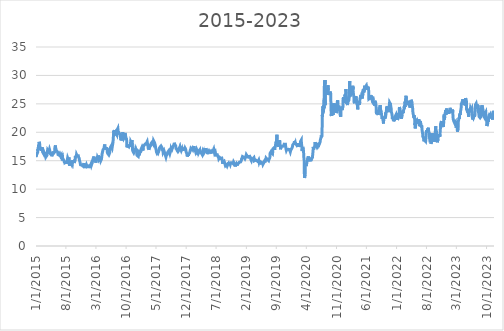
| Category | Fiyat |
|---|---|
| 1/1/15 | 15.65 |
| 1/2/15 | 15.72 |
| 1/5/15 | 15.73 |
| 1/6/15 | 16.17 |
| 1/7/15 | 16.51 |
| 1/8/15 | 16.49 |
| 1/9/15 | 16.31 |
| 1/12/15 | 16.48 |
| 1/13/15 | 16.53 |
| 1/14/15 | 17.02 |
| 1/15/15 | 16.81 |
| 1/16/15 | 16.89 |
| 1/19/15 | 17.7 |
| 1/20/15 | 17.66 |
| 1/21/15 | 17.94 |
| 1/22/15 | 18.08 |
| 1/23/15 | 18.32 |
| 1/26/15 | 18.3 |
| 1/27/15 | 17.88 |
| 1/28/15 | 18.02 |
| 1/29/15 | 17.96 |
| 1/30/15 | 16.94 |
| 2/2/15 | 17.16 |
| 2/3/15 | 17.2 |
| 2/4/15 | 17.29 |
| 2/5/15 | 17.36 |
| 2/6/15 | 17.24 |
| 2/9/15 | 16.76 |
| 2/10/15 | 16.98 |
| 2/11/15 | 16.89 |
| 2/12/15 | 16.78 |
| 2/13/15 | 16.82 |
| 2/16/15 | 17.33 |
| 2/17/15 | 17.29 |
| 2/18/15 | 16.47 |
| 2/19/15 | 16.45 |
| 2/20/15 | 16.37 |
| 2/23/15 | 16.24 |
| 2/24/15 | 16.28 |
| 2/25/15 | 16.24 |
| 2/26/15 | 16.53 |
| 2/27/15 | 16.53 |
| 3/2/15 | 16.57 |
| 3/3/15 | 16.36 |
| 3/4/15 | 16.25 |
| 3/5/15 | 16.21 |
| 3/6/15 | 16.16 |
| 3/9/15 | 15.89 |
| 3/10/15 | 15.72 |
| 3/11/15 | 15.63 |
| 3/12/15 | 15.5 |
| 3/13/15 | 15.56 |
| 3/16/15 | 15.63 |
| 3/17/15 | 15.64 |
| 3/18/15 | 15.55 |
| 3/19/15 | 15.94 |
| 3/20/15 | 16.11 |
| 3/23/15 | 16.74 |
| 3/24/15 | 16.92 |
| 3/25/15 | 16.93 |
| 3/26/15 | 16.94 |
| 3/27/15 | 17.08 |
| 3/30/15 | 16.93 |
| 3/31/15 | 16.68 |
| 4/1/15 | 16.6 |
| 4/2/15 | 16.95 |
| 4/3/15 | 16.73 |
| 4/6/15 | 17 |
| 4/7/15 | 16.94 |
| 4/8/15 | 16.82 |
| 4/9/15 | 16.51 |
| 4/10/15 | 16.15 |
| 4/13/15 | 16.43 |
| 4/14/15 | 16.26 |
| 4/15/15 | 16.14 |
| 4/16/15 | 16.29 |
| 4/17/15 | 16.29 |
| 4/20/15 | 16.28 |
| 4/21/15 | 15.96 |
| 4/22/15 | 15.92 |
| 4/23/15 | 15.78 |
| 4/24/15 | 15.9 |
| 4/27/15 | 15.74 |
| 4/28/15 | 16.38 |
| 4/29/15 | 16.61 |
| 4/30/15 | 16.55 |
| 5/1/15 | 16.14 |
| 5/4/15 | 16.15 |
| 5/5/15 | 16.42 |
| 5/6/15 | 16.53 |
| 5/7/15 | 16.52 |
| 5/8/15 | 16.32 |
| 5/11/15 | 16.42 |
| 5/12/15 | 16.29 |
| 5/13/15 | 16.51 |
| 5/14/15 | 17.14 |
| 5/15/15 | 17.43 |
| 5/18/15 | 17.49 |
| 5/19/15 | 17.69 |
| 5/20/15 | 17.09 |
| 5/21/15 | 17.1 |
| 5/22/15 | 17.13 |
| 5/25/15 | 17.03 |
| 5/26/15 | 17.11 |
| 5/27/15 | 16.73 |
| 5/28/15 | 16.67 |
| 5/29/15 | 16.67 |
| 6/1/15 | 16.7 |
| 6/2/15 | 16.73 |
| 6/3/15 | 16.77 |
| 6/4/15 | 16.49 |
| 6/5/15 | 16.1 |
| 6/8/15 | 16.06 |
| 6/9/15 | 15.94 |
| 6/10/15 | 15.96 |
| 6/11/15 | 16.01 |
| 6/12/15 | 16.03 |
| 6/15/15 | 15.94 |
| 6/16/15 | 16.06 |
| 6/17/15 | 16.01 |
| 6/18/15 | 16.09 |
| 6/19/15 | 16.16 |
| 6/22/15 | 16.11 |
| 6/23/15 | 16.16 |
| 6/24/15 | 15.83 |
| 6/25/15 | 15.85 |
| 6/26/15 | 15.84 |
| 6/29/15 | 16.01 |
| 6/30/15 | 15.76 |
| 7/1/15 | 15.7 |
| 7/2/15 | 15.54 |
| 7/3/15 | 15.68 |
| 7/6/15 | 15.68 |
| 7/7/15 | 15.72 |
| 7/8/15 | 15.06 |
| 7/9/15 | 15.14 |
| 7/10/15 | 15.38 |
| 7/13/15 | 15.53 |
| 7/14/15 | 15.49 |
| 7/15/15 | 15.36 |
| 7/16/15 | 15.09 |
| 7/17/15 | 14.99 |
| 7/20/15 | 14.86 |
| 7/21/15 | 14.64 |
| 7/22/15 | 14.83 |
| 7/23/15 | 14.78 |
| 7/24/15 | 14.63 |
| 7/27/15 | 14.72 |
| 7/28/15 | 14.56 |
| 7/29/15 | 14.71 |
| 7/30/15 | 14.79 |
| 7/31/15 | 14.72 |
| 8/3/15 | 14.78 |
| 8/4/15 | 14.48 |
| 8/5/15 | 14.58 |
| 8/6/15 | 14.53 |
| 8/7/15 | 14.65 |
| 8/10/15 | 14.8 |
| 8/11/15 | 15.22 |
| 8/12/15 | 15.32 |
| 8/13/15 | 15.51 |
| 8/14/15 | 15.43 |
| 8/17/15 | 15.25 |
| 8/18/15 | 15.32 |
| 8/19/15 | 14.89 |
| 8/20/15 | 15.3 |
| 8/21/15 | 15.54 |
| 8/24/15 | 15.36 |
| 8/25/15 | 14.82 |
| 8/26/15 | 14.71 |
| 8/27/15 | 14.11 |
| 8/28/15 | 14.51 |
| 8/31/15 | 14.59 |
| 9/1/15 | 14.62 |
| 9/2/15 | 14.56 |
| 9/3/15 | 14.67 |
| 9/4/15 | 14.7 |
| 9/7/15 | 14.61 |
| 9/8/15 | 14.49 |
| 9/9/15 | 14.78 |
| 9/10/15 | 14.59 |
| 9/11/15 | 14.68 |
| 9/14/15 | 14.59 |
| 9/15/15 | 14.38 |
| 9/16/15 | 14.4 |
| 9/17/15 | 14.9 |
| 9/18/15 | 15.12 |
| 9/21/15 | 15.17 |
| 9/22/15 | 15.18 |
| 9/23/15 | 14.76 |
| 9/24/15 | 14.78 |
| 9/25/15 | 15.06 |
| 9/28/15 | 15.07 |
| 9/29/15 | 14.59 |
| 9/30/15 | 14.62 |
| 10/1/15 | 14.51 |
| 10/2/15 | 14.52 |
| 10/5/15 | 15.24 |
| 10/6/15 | 15.62 |
| 10/7/15 | 15.86 |
| 10/8/15 | 16.03 |
| 10/9/15 | 15.68 |
| 10/12/15 | 15.78 |
| 10/13/15 | 15.82 |
| 10/14/15 | 15.9 |
| 10/15/15 | 16.1 |
| 10/16/15 | 16.09 |
| 10/19/15 | 16 |
| 10/20/15 | 15.83 |
| 10/21/15 | 15.88 |
| 10/22/15 | 15.69 |
| 10/23/15 | 15.81 |
| 10/26/15 | 15.8 |
| 10/27/15 | 15.83 |
| 10/28/15 | 15.85 |
| 10/29/15 | 15.9 |
| 10/30/15 | 15.59 |
| 11/2/15 | 15.52 |
| 11/3/15 | 15.41 |
| 11/4/15 | 15.26 |
| 11/5/15 | 15.04 |
| 11/6/15 | 14.95 |
| 11/9/15 | 14.73 |
| 11/10/15 | 14.55 |
| 11/11/15 | 14.4 |
| 11/12/15 | 14.29 |
| 11/13/15 | 14.29 |
| 11/16/15 | 14.34 |
| 11/17/15 | 14.23 |
| 11/18/15 | 14.17 |
| 11/19/15 | 14.17 |
| 11/20/15 | 14.23 |
| 11/23/15 | 14.14 |
| 11/24/15 | 14.12 |
| 11/25/15 | 14.18 |
| 11/26/15 | 14.17 |
| 11/27/15 | 14.27 |
| 11/30/15 | 14.04 |
| 12/1/15 | 14.09 |
| 12/2/15 | 14.2 |
| 12/3/15 | 14.02 |
| 12/4/15 | 14.08 |
| 12/7/15 | 14.58 |
| 12/8/15 | 14.24 |
| 12/9/15 | 14.14 |
| 12/10/15 | 14.14 |
| 12/11/15 | 14.12 |
| 12/14/15 | 13.91 |
| 12/15/15 | 13.7 |
| 12/16/15 | 13.75 |
| 12/17/15 | 14.17 |
| 12/18/15 | 13.71 |
| 12/21/15 | 14.1 |
| 12/22/15 | 14.26 |
| 12/23/15 | 14.26 |
| 12/24/15 | 14.3 |
| 12/25/15 | 14.36 |
| 12/28/15 | 14.33 |
| 12/29/15 | 13.95 |
| 12/30/15 | 13.95 |
| 12/31/15 | 13.85 |
| 1/1/16 | 13.85 |
| 1/4/16 | 13.82 |
| 1/5/16 | 13.85 |
| 1/6/16 | 13.95 |
| 1/7/16 | 14 |
| 1/8/16 | 14.3 |
| 1/11/16 | 13.96 |
| 1/12/16 | 13.85 |
| 1/13/16 | 13.79 |
| 1/14/16 | 14.13 |
| 1/15/16 | 13.85 |
| 1/18/16 | 13.91 |
| 1/19/16 | 13.94 |
| 1/20/16 | 14.02 |
| 1/21/16 | 14.15 |
| 1/22/16 | 14.08 |
| 1/25/16 | 14.05 |
| 1/26/16 | 14.24 |
| 1/27/16 | 14.5 |
| 1/28/16 | 14.48 |
| 1/29/16 | 14.25 |
| 2/1/16 | 14.24 |
| 2/2/16 | 14.31 |
| 2/3/16 | 14.3 |
| 2/4/16 | 14.68 |
| 2/5/16 | 14.87 |
| 2/8/16 | 14.99 |
| 2/9/16 | 15.3 |
| 2/10/16 | 15.23 |
| 2/11/16 | 15.28 |
| 2/12/16 | 15.49 |
| 2/15/16 | 15.74 |
| 2/16/16 | 15.34 |
| 2/17/16 | 15.22 |
| 2/18/16 | 15.27 |
| 2/19/16 | 15.41 |
| 2/22/16 | 15.34 |
| 2/23/16 | 15.18 |
| 2/24/16 | 15.3 |
| 2/25/16 | 15.24 |
| 2/26/16 | 15.14 |
| 2/29/16 | 14.66 |
| 3/1/16 | 14.87 |
| 3/2/16 | 14.84 |
| 3/3/16 | 14.96 |
| 3/4/16 | 15.24 |
| 3/7/16 | 15.52 |
| 3/8/16 | 15.64 |
| 3/9/16 | 15.3 |
| 3/10/16 | 15.29 |
| 3/11/16 | 15.59 |
| 3/14/16 | 15.48 |
| 3/15/16 | 15.36 |
| 3/16/16 | 15.26 |
| 3/17/16 | 15.62 |
| 3/18/16 | 15.93 |
| 3/21/16 | 15.82 |
| 3/22/16 | 15.83 |
| 3/23/16 | 15.87 |
| 3/24/16 | 15.19 |
| 3/25/16 | 15.14 |
| 3/28/16 | 15.18 |
| 3/29/16 | 15.22 |
| 3/30/16 | 15.36 |
| 3/31/16 | 15.21 |
| 4/1/16 | 15.43 |
| 4/4/16 | 15.01 |
| 4/5/16 | 14.93 |
| 4/6/16 | 15.13 |
| 4/7/16 | 15.06 |
| 4/8/16 | 15.22 |
| 4/11/16 | 15.37 |
| 4/12/16 | 15.93 |
| 4/13/16 | 16.18 |
| 4/14/16 | 16.2 |
| 4/15/16 | 16.16 |
| 4/18/16 | 16.25 |
| 4/19/16 | 16.23 |
| 4/20/16 | 16.94 |
| 4/21/16 | 16.94 |
| 4/22/16 | 16.99 |
| 4/25/16 | 16.93 |
| 4/26/16 | 16.98 |
| 4/27/16 | 17.16 |
| 4/28/16 | 17.23 |
| 4/29/16 | 17.57 |
| 5/2/16 | 17.86 |
| 5/3/16 | 17.54 |
| 5/4/16 | 17.41 |
| 5/5/16 | 17.37 |
| 5/6/16 | 17.33 |
| 5/9/16 | 17.39 |
| 5/10/16 | 17.01 |
| 5/11/16 | 17.11 |
| 5/12/16 | 17.4 |
| 5/13/16 | 16.97 |
| 5/16/16 | 17.06 |
| 5/17/16 | 17.13 |
| 5/18/16 | 17.23 |
| 5/19/16 | 16.85 |
| 5/20/16 | 16.48 |
| 5/23/16 | 16.48 |
| 5/24/16 | 16.37 |
| 5/25/16 | 16.2 |
| 5/26/16 | 16.26 |
| 5/27/16 | 16.3 |
| 5/30/16 | 16.22 |
| 5/31/16 | 16.01 |
| 6/1/16 | 16 |
| 6/2/16 | 15.96 |
| 6/3/16 | 15.99 |
| 6/6/16 | 16.39 |
| 6/7/16 | 16.47 |
| 6/8/16 | 16.41 |
| 6/9/16 | 17.049 |
| 6/10/16 | 17.29 |
| 6/13/16 | 17.343 |
| 6/14/16 | 17.441 |
| 6/15/16 | 17.395 |
| 6/16/16 | 17.556 |
| 6/17/16 | 17.203 |
| 6/20/16 | 17.4 |
| 6/21/16 | 17.506 |
| 6/22/16 | 17.307 |
| 6/23/16 | 17.224 |
| 6/24/16 | 17.157 |
| 6/27/16 | 17.834 |
| 6/28/16 | 17.742 |
| 6/29/16 | 17.791 |
| 6/30/16 | 18.297 |
| 7/1/16 | 18.797 |
| 7/4/16 | 19.776 |
| 7/5/16 | 20.303 |
| 7/6/16 | 19.985 |
| 7/7/16 | 20.085 |
| 7/8/16 | 19.68 |
| 7/11/16 | 20.358 |
| 7/12/16 | 20.318 |
| 7/13/16 | 20.167 |
| 7/14/16 | 20.405 |
| 7/15/16 | 20.351 |
| 7/18/16 | 20.168 |
| 7/19/16 | 20.048 |
| 7/20/16 | 19.91 |
| 7/21/16 | 19.42 |
| 7/22/16 | 19.755 |
| 7/25/16 | 19.657 |
| 7/26/16 | 19.579 |
| 7/27/16 | 19.642 |
| 7/28/16 | 20.352 |
| 7/29/16 | 20.183 |
| 8/1/16 | 20.349 |
| 8/2/16 | 20.461 |
| 8/3/16 | 20.676 |
| 8/4/16 | 20.423 |
| 8/5/16 | 20.371 |
| 8/8/16 | 19.6 |
| 8/9/16 | 19.719 |
| 8/10/16 | 19.934 |
| 8/11/16 | 20.105 |
| 8/12/16 | 19.965 |
| 8/15/16 | 19.78 |
| 8/16/16 | 19.827 |
| 8/17/16 | 19.801 |
| 8/18/16 | 19.69 |
| 8/19/16 | 19.798 |
| 8/22/16 | 19.014 |
| 8/23/16 | 18.94 |
| 8/24/16 | 18.879 |
| 8/25/16 | 18.567 |
| 8/26/16 | 18.53 |
| 8/29/16 | 18.677 |
| 8/30/16 | 18.898 |
| 8/31/16 | 18.635 |
| 9/1/16 | 18.667 |
| 9/2/16 | 18.899 |
| 9/5/16 | 19.415 |
| 9/6/16 | 19.525 |
| 9/7/16 | 20.035 |
| 9/8/16 | 19.814 |
| 9/9/16 | 19.607 |
| 9/12/16 | 19.101 |
| 9/13/16 | 19.1 |
| 9/14/16 | 18.894 |
| 9/15/16 | 18.972 |
| 9/16/16 | 18.982 |
| 9/19/16 | 18.813 |
| 9/20/16 | 19.166 |
| 9/21/16 | 19.315 |
| 9/22/16 | 19.867 |
| 9/23/16 | 19.89 |
| 9/26/16 | 19.705 |
| 9/27/16 | 19.43 |
| 9/28/16 | 19.115 |
| 9/29/16 | 19.196 |
| 9/30/16 | 19.105 |
| 10/3/16 | 19.169 |
| 10/4/16 | 18.811 |
| 10/5/16 | 17.806 |
| 10/6/16 | 17.754 |
| 10/7/16 | 17.341 |
| 10/10/16 | 17.607 |
| 10/11/16 | 17.647 |
| 10/12/16 | 17.47 |
| 10/13/16 | 17.488 |
| 10/14/16 | 17.504 |
| 10/17/16 | 17.463 |
| 10/18/16 | 17.464 |
| 10/19/16 | 17.652 |
| 10/20/16 | 17.7 |
| 10/21/16 | 17.528 |
| 10/24/16 | 17.567 |
| 10/25/16 | 17.649 |
| 10/26/16 | 17.762 |
| 10/27/16 | 17.633 |
| 10/28/16 | 17.64 |
| 10/31/16 | 17.847 |
| 11/1/16 | 17.916 |
| 11/2/16 | 18.403 |
| 11/3/16 | 18.51 |
| 11/4/16 | 18.377 |
| 11/7/16 | 18.161 |
| 11/8/16 | 18.222 |
| 11/9/16 | 18.34 |
| 11/10/16 | 18.515 |
| 11/11/16 | 18.62 |
| 11/14/16 | 17.393 |
| 11/15/16 | 16.909 |
| 11/16/16 | 17.055 |
| 11/17/16 | 16.974 |
| 11/18/16 | 16.645 |
| 11/21/16 | 16.595 |
| 11/22/16 | 16.593 |
| 11/23/16 | 16.616 |
| 11/24/16 | 16.381 |
| 11/25/16 | 16.295 |
| 11/28/16 | 16.504 |
| 11/29/16 | 16.66 |
| 11/30/16 | 16.636 |
| 12/1/16 | 16.503 |
| 12/2/16 | 16.525 |
| 12/5/16 | 16.931 |
| 12/6/16 | 16.753 |
| 12/7/16 | 16.735 |
| 12/8/16 | 17.105 |
| 12/9/16 | 17 |
| 12/12/16 | 16.887 |
| 12/13/16 | 17.07 |
| 12/14/16 | 16.895 |
| 12/15/16 | 16.849 |
| 12/16/16 | 15.98 |
| 12/19/16 | 16.077 |
| 12/20/16 | 15.973 |
| 12/21/16 | 16.08 |
| 12/22/16 | 15.961 |
| 12/23/16 | 15.832 |
| 12/26/16 | 15.75 |
| 12/27/16 | 15.784 |
| 12/28/16 | 15.99 |
| 12/29/16 | 16.047 |
| 12/30/16 | 16.174 |
| 1/2/17 | 15.94 |
| 1/3/17 | 15.92 |
| 1/4/17 | 16.31 |
| 1/5/17 | 16.457 |
| 1/6/17 | 16.6 |
| 1/9/17 | 16.482 |
| 1/10/17 | 16.567 |
| 1/11/17 | 16.808 |
| 1/12/17 | 16.744 |
| 1/13/17 | 16.788 |
| 1/16/17 | 16.906 |
| 1/17/17 | 16.84 |
| 1/18/17 | 17.212 |
| 1/19/17 | 17.047 |
| 1/20/17 | 17.021 |
| 1/23/17 | 17.116 |
| 1/24/17 | 17.241 |
| 1/25/17 | 17.14 |
| 1/26/17 | 17 |
| 1/27/17 | 16.806 |
| 1/30/17 | 17.175 |
| 1/31/17 | 17.16 |
| 2/1/17 | 17.57 |
| 2/2/17 | 17.57 |
| 2/3/17 | 17.5 |
| 2/6/17 | 17.52 |
| 2/7/17 | 17.752 |
| 2/8/17 | 17.7 |
| 2/9/17 | 17.82 |
| 2/10/17 | 17.672 |
| 2/13/17 | 17.935 |
| 2/14/17 | 17.821 |
| 2/15/17 | 17.957 |
| 2/16/17 | 17.989 |
| 2/17/17 | 18.108 |
| 2/20/17 | 18.015 |
| 2/21/17 | 18.056 |
| 2/22/17 | 17.965 |
| 2/23/17 | 18.048 |
| 2/24/17 | 18.195 |
| 2/27/17 | 18.36 |
| 2/28/17 | 18.258 |
| 3/1/17 | 18.31 |
| 3/2/17 | 18.412 |
| 3/3/17 | 17.762 |
| 3/6/17 | 17.945 |
| 3/7/17 | 17.785 |
| 3/8/17 | 17.489 |
| 3/9/17 | 17.233 |
| 3/10/17 | 16.944 |
| 3/13/17 | 17.06 |
| 3/14/17 | 16.999 |
| 3/15/17 | 16.915 |
| 3/16/17 | 17.368 |
| 3/17/17 | 17.34 |
| 3/20/17 | 17.425 |
| 3/21/17 | 17.455 |
| 3/22/17 | 17.577 |
| 3/23/17 | 17.549 |
| 3/24/17 | 17.603 |
| 3/27/17 | 17.83 |
| 3/28/17 | 18.077 |
| 3/29/17 | 18.218 |
| 3/30/17 | 18.223 |
| 3/31/17 | 18.13 |
| 4/3/17 | 18.274 |
| 4/4/17 | 18.31 |
| 4/5/17 | 18.3 |
| 4/6/17 | 18.329 |
| 4/7/17 | 18.283 |
| 4/10/17 | 17.969 |
| 4/11/17 | 17.951 |
| 4/12/17 | 18.319 |
| 4/13/17 | 18.518 |
| 4/14/17 | 18.535 |
| 4/17/17 | 18.647 |
| 4/18/17 | 18.424 |
| 4/19/17 | 18.346 |
| 4/20/17 | 18.17 |
| 4/21/17 | 18.057 |
| 4/24/17 | 17.831 |
| 4/25/17 | 17.987 |
| 4/26/17 | 17.627 |
| 4/27/17 | 17.51 |
| 4/28/17 | 17.252 |
| 5/1/17 | 17.242 |
| 5/2/17 | 16.865 |
| 5/3/17 | 16.884 |
| 5/4/17 | 16.509 |
| 5/5/17 | 16.358 |
| 5/8/17 | 16.291 |
| 5/9/17 | 16.235 |
| 5/10/17 | 16.228 |
| 5/11/17 | 16.238 |
| 5/12/17 | 16.3 |
| 5/15/17 | 16.542 |
| 5/16/17 | 16.63 |
| 5/17/17 | 16.828 |
| 5/18/17 | 16.905 |
| 5/19/17 | 16.62 |
| 5/22/17 | 16.825 |
| 5/23/17 | 17.147 |
| 5/24/17 | 17.096 |
| 5/25/17 | 17.257 |
| 5/26/17 | 17.142 |
| 5/29/17 | 17.392 |
| 5/30/17 | 17.463 |
| 5/31/17 | 17.39 |
| 6/1/17 | 17.36 |
| 6/2/17 | 17.301 |
| 6/5/17 | 17.595 |
| 6/6/17 | 17.588 |
| 6/7/17 | 17.738 |
| 6/8/17 | 17.561 |
| 6/9/17 | 17.472 |
| 6/12/17 | 17.279 |
| 6/13/17 | 16.96 |
| 6/14/17 | 16.825 |
| 6/15/17 | 16.9 |
| 6/16/17 | 16.791 |
| 6/19/17 | 16.733 |
| 6/20/17 | 16.495 |
| 6/21/17 | 16.498 |
| 6/22/17 | 16.512 |
| 6/23/17 | 16.55 |
| 6/26/17 | 16.782 |
| 6/27/17 | 16.61 |
| 6/28/17 | 16.68 |
| 6/29/17 | 16.815 |
| 6/30/17 | 16.67 |
| 7/3/17 | 16.678 |
| 7/4/17 | 16.135 |
| 7/5/17 | 16.09 |
| 7/6/17 | 16.063 |
| 7/7/17 | 16.07 |
| 7/10/17 | 15.639 |
| 7/11/17 | 15.667 |
| 7/12/17 | 15.84 |
| 7/13/17 | 15.934 |
| 7/14/17 | 15.689 |
| 7/17/17 | 16.038 |
| 7/18/17 | 16.136 |
| 7/19/17 | 16.259 |
| 7/20/17 | 16.283 |
| 7/21/17 | 16.314 |
| 7/24/17 | 16.552 |
| 7/25/17 | 16.51 |
| 7/26/17 | 16.478 |
| 7/27/17 | 16.669 |
| 7/28/17 | 16.593 |
| 7/31/17 | 16.796 |
| 8/1/17 | 16.838 |
| 8/2/17 | 16.74 |
| 8/3/17 | 16.616 |
| 8/4/17 | 16.681 |
| 8/7/17 | 16.277 |
| 8/8/17 | 16.293 |
| 8/9/17 | 16.458 |
| 8/10/17 | 16.983 |
| 8/11/17 | 17.164 |
| 8/14/17 | 17.114 |
| 8/15/17 | 17.064 |
| 8/16/17 | 16.643 |
| 8/17/17 | 17.159 |
| 8/18/17 | 17.047 |
| 8/21/17 | 16.973 |
| 8/22/17 | 17.032 |
| 8/23/17 | 17.015 |
| 8/24/17 | 17.082 |
| 8/25/17 | 16.972 |
| 8/28/17 | 17.098 |
| 8/29/17 | 17.483 |
| 8/30/17 | 17.404 |
| 8/31/17 | 17.433 |
| 9/1/17 | 17.614 |
| 9/4/17 | 17.8 |
| 9/5/17 | 17.903 |
| 9/6/17 | 17.933 |
| 9/7/17 | 17.909 |
| 9/8/17 | 18.151 |
| 9/11/17 | 17.805 |
| 9/12/17 | 17.793 |
| 9/13/17 | 17.91 |
| 9/14/17 | 17.771 |
| 9/15/17 | 17.8 |
| 9/18/17 | 17.6 |
| 9/19/17 | 17.167 |
| 9/20/17 | 17.296 |
| 9/21/17 | 17.16 |
| 9/22/17 | 16.994 |
| 9/25/17 | 16.974 |
| 9/26/17 | 17.137 |
| 9/27/17 | 16.813 |
| 9/28/17 | 16.77 |
| 9/29/17 | 16.87 |
| 10/2/17 | 16.652 |
| 10/3/17 | 16.591 |
| 10/4/17 | 16.643 |
| 10/5/17 | 16.593 |
| 10/6/17 | 16.624 |
| 10/9/17 | 16.82 |
| 10/10/17 | 16.953 |
| 10/11/17 | 17.104 |
| 10/12/17 | 17.18 |
| 10/13/17 | 17.234 |
| 10/16/17 | 17.39 |
| 10/17/17 | 17.235 |
| 10/18/17 | 17.012 |
| 10/19/17 | 17.005 |
| 10/20/17 | 17.251 |
| 10/23/17 | 17.061 |
| 10/24/17 | 17.098 |
| 10/25/17 | 16.997 |
| 10/26/17 | 16.977 |
| 10/27/17 | 16.788 |
| 10/30/17 | 16.823 |
| 10/31/17 | 16.849 |
| 11/1/17 | 16.735 |
| 11/2/17 | 17.169 |
| 11/3/17 | 17.117 |
| 11/6/17 | 16.816 |
| 11/7/17 | 17.234 |
| 11/8/17 | 16.979 |
| 11/9/17 | 17.04 |
| 11/10/17 | 16.997 |
| 11/13/17 | 16.843 |
| 11/14/17 | 17.071 |
| 11/15/17 | 17.027 |
| 11/16/17 | 16.991 |
| 11/17/17 | 17.082 |
| 11/20/17 | 17.31 |
| 11/21/17 | 16.946 |
| 11/22/17 | 16.965 |
| 11/23/17 | 17.188 |
| 11/24/17 | 17.069 |
| 11/27/17 | 17 |
| 11/28/17 | 17.07 |
| 11/29/17 | 16.858 |
| 11/30/17 | 16.554 |
| 12/1/17 | 16.436 |
| 12/4/17 | 16.321 |
| 12/5/17 | 16.355 |
| 12/6/17 | 16.108 |
| 12/7/17 | 15.959 |
| 12/8/17 | 15.729 |
| 12/11/17 | 15.803 |
| 12/12/17 | 15.709 |
| 12/13/17 | 15.724 |
| 12/14/17 | 16.088 |
| 12/15/17 | 15.899 |
| 12/18/17 | 16 |
| 12/19/17 | 16.157 |
| 12/20/17 | 16.142 |
| 12/21/17 | 16.199 |
| 12/22/17 | 16.147 |
| 12/25/17 | 16.38 |
| 12/26/17 | 16.364 |
| 12/27/17 | 16.544 |
| 12/28/17 | 16.688 |
| 12/29/17 | 16.844 |
| 1/1/18 | 17.005 |
| 1/2/18 | 16.974 |
| 1/3/18 | 17.192 |
| 1/4/18 | 17.134 |
| 1/5/18 | 17.232 |
| 1/8/18 | 17.235 |
| 1/9/18 | 17.159 |
| 1/10/18 | 16.998 |
| 1/11/18 | 16.992 |
| 1/12/18 | 16.994 |
| 1/15/18 | 17.205 |
| 1/16/18 | 17.311 |
| 1/17/18 | 17.198 |
| 1/18/18 | 17.027 |
| 1/19/18 | 16.972 |
| 1/22/18 | 17.053 |
| 1/23/18 | 17.013 |
| 1/24/18 | 17.047 |
| 1/25/18 | 17.569 |
| 1/26/18 | 17.295 |
| 1/29/18 | 17.372 |
| 1/30/18 | 17.16 |
| 1/31/18 | 17.147 |
| 2/1/18 | 17.352 |
| 2/2/18 | 17.25 |
| 2/5/18 | 16.625 |
| 2/6/18 | 16.744 |
| 2/7/18 | 16.637 |
| 2/8/18 | 16.372 |
| 2/9/18 | 16.415 |
| 2/12/18 | 16.347 |
| 2/13/18 | 16.566 |
| 2/14/18 | 16.553 |
| 2/15/18 | 16.869 |
| 2/16/18 | 16.877 |
| 2/19/18 | 16.642 |
| 2/20/18 | 16.643 |
| 2/21/18 | 16.463 |
| 2/22/18 | 16.489 |
| 2/23/18 | 16.617 |
| 2/26/18 | 16.509 |
| 2/27/18 | 16.661 |
| 2/28/18 | 16.424 |
| 3/1/18 | 16.409 |
| 3/2/18 | 16.485 |
| 3/5/18 | 16.524 |
| 3/6/18 | 16.456 |
| 3/7/18 | 16.759 |
| 3/8/18 | 16.501 |
| 3/9/18 | 16.498 |
| 3/12/18 | 16.642 |
| 3/13/18 | 16.544 |
| 3/14/18 | 16.611 |
| 3/15/18 | 16.533 |
| 3/16/18 | 16.409 |
| 3/19/18 | 16.36 |
| 3/20/18 | 16.317 |
| 3/21/18 | 16.204 |
| 3/22/18 | 16.587 |
| 3/23/18 | 16.405 |
| 3/26/18 | 16.615 |
| 3/27/18 | 16.725 |
| 3/28/18 | 16.581 |
| 3/29/18 | 16.306 |
| 4/2/18 | 16.365 |
| 4/3/18 | 16.608 |
| 4/4/18 | 16.436 |
| 4/5/18 | 16.331 |
| 4/6/18 | 16.41 |
| 4/9/18 | 16.453 |
| 4/10/18 | 16.487 |
| 4/11/18 | 16.578 |
| 4/12/18 | 16.701 |
| 4/13/18 | 16.47 |
| 4/16/18 | 16.663 |
| 4/17/18 | 16.672 |
| 4/18/18 | 16.783 |
| 4/19/18 | 17.215 |
| 4/20/18 | 17.241 |
| 4/23/18 | 17.135 |
| 4/24/18 | 16.638 |
| 4/25/18 | 16.725 |
| 4/26/18 | 16.589 |
| 4/27/18 | 16.529 |
| 4/30/18 | 16.535 |
| 5/1/18 | 16.347 |
| 5/2/18 | 16.153 |
| 5/3/18 | 16.404 |
| 5/4/18 | 16.448 |
| 5/7/18 | 16.558 |
| 5/8/18 | 16.485 |
| 5/9/18 | 16.509 |
| 5/10/18 | 16.526 |
| 5/11/18 | 16.729 |
| 5/14/18 | 16.69 |
| 5/15/18 | 16.542 |
| 5/16/18 | 16.277 |
| 5/17/18 | 16.36 |
| 5/18/18 | 16.463 |
| 5/21/18 | 16.429 |
| 5/22/18 | 16.52 |
| 5/23/18 | 16.543 |
| 5/24/18 | 16.474 |
| 5/25/18 | 16.668 |
| 5/28/18 | 16.494 |
| 5/29/18 | 16.458 |
| 5/30/18 | 16.387 |
| 5/31/18 | 16.507 |
| 6/1/18 | 16.448 |
| 6/4/18 | 16.423 |
| 6/5/18 | 16.402 |
| 6/6/18 | 16.513 |
| 6/7/18 | 16.685 |
| 6/8/18 | 16.73 |
| 6/11/18 | 16.785 |
| 6/12/18 | 16.897 |
| 6/13/18 | 16.871 |
| 6/14/18 | 17.059 |
| 6/15/18 | 17.186 |
| 6/18/18 | 16.535 |
| 6/19/18 | 16.484 |
| 6/20/18 | 16.304 |
| 6/21/18 | 16.314 |
| 6/22/18 | 16.349 |
| 6/25/18 | 16.511 |
| 6/26/18 | 16.349 |
| 6/27/18 | 16.248 |
| 6/28/18 | 16.077 |
| 6/29/18 | 15.995 |
| 7/2/18 | 16.115 |
| 7/3/18 | 15.839 |
| 7/4/18 | 16.055 |
| 7/5/18 | 16.09 |
| 7/6/18 | 16.018 |
| 7/9/18 | 16.049 |
| 7/10/18 | 16.114 |
| 7/11/18 | 16.077 |
| 7/12/18 | 15.817 |
| 7/13/18 | 15.944 |
| 7/16/18 | 15.84 |
| 7/17/18 | 15.806 |
| 7/18/18 | 15.583 |
| 7/19/18 | 15.575 |
| 7/20/18 | 15.342 |
| 7/23/18 | 15.509 |
| 7/24/18 | 15.408 |
| 7/25/18 | 15.483 |
| 7/26/18 | 15.572 |
| 7/27/18 | 15.414 |
| 7/30/18 | 15.481 |
| 7/31/18 | 15.505 |
| 8/1/18 | 15.562 |
| 8/2/18 | 15.395 |
| 8/3/18 | 15.341 |
| 8/6/18 | 15.471 |
| 8/7/18 | 15.308 |
| 8/8/18 | 15.361 |
| 8/9/18 | 15.431 |
| 8/10/18 | 15.453 |
| 8/13/18 | 15.335 |
| 8/14/18 | 14.991 |
| 8/15/18 | 15.069 |
| 8/16/18 | 14.465 |
| 8/17/18 | 14.655 |
| 8/20/18 | 14.784 |
| 8/21/18 | 14.761 |
| 8/22/18 | 14.759 |
| 8/23/18 | 14.766 |
| 8/24/18 | 14.49 |
| 8/27/18 | 14.886 |
| 8/28/18 | 14.915 |
| 8/29/18 | 14.72 |
| 8/30/18 | 14.815 |
| 8/31/18 | 14.56 |
| 9/3/18 | 14.538 |
| 9/4/18 | 14.534 |
| 9/5/18 | 14.11 |
| 9/6/18 | 14.205 |
| 9/7/18 | 14.171 |
| 9/10/18 | 14.182 |
| 9/11/18 | 14.189 |
| 9/12/18 | 14.152 |
| 9/13/18 | 14.291 |
| 9/14/18 | 14.193 |
| 9/17/18 | 14.075 |
| 9/18/18 | 14.182 |
| 9/19/18 | 14.165 |
| 9/20/18 | 14.262 |
| 9/21/18 | 14.343 |
| 9/24/18 | 14.309 |
| 9/25/18 | 14.277 |
| 9/26/18 | 14.485 |
| 9/27/18 | 14.352 |
| 9/28/18 | 14.28 |
| 10/1/18 | 14.689 |
| 10/2/18 | 14.506 |
| 10/3/18 | 14.73 |
| 10/4/18 | 14.65 |
| 10/5/18 | 14.63 |
| 10/8/18 | 14.655 |
| 10/9/18 | 14.345 |
| 10/10/18 | 14.389 |
| 10/11/18 | 14.341 |
| 10/12/18 | 14.624 |
| 10/15/18 | 14.615 |
| 10/16/18 | 14.73 |
| 10/17/18 | 14.646 |
| 10/18/18 | 14.607 |
| 10/19/18 | 14.62 |
| 10/22/18 | 14.655 |
| 10/23/18 | 14.547 |
| 10/24/18 | 14.793 |
| 10/25/18 | 14.698 |
| 10/26/18 | 14.626 |
| 10/29/18 | 14.705 |
| 10/30/18 | 14.455 |
| 10/31/18 | 14.472 |
| 11/1/18 | 14.285 |
| 11/2/18 | 14.765 |
| 11/5/18 | 14.769 |
| 11/6/18 | 14.646 |
| 11/7/18 | 14.535 |
| 11/8/18 | 14.588 |
| 11/9/18 | 14.432 |
| 11/12/18 | 14.169 |
| 11/13/18 | 13.995 |
| 11/14/18 | 13.983 |
| 11/15/18 | 14.135 |
| 11/16/18 | 14.289 |
| 11/19/18 | 14.402 |
| 11/20/18 | 14.425 |
| 11/21/18 | 14.32 |
| 11/22/18 | 14.523 |
| 11/23/18 | 14.531 |
| 11/26/18 | 14.322 |
| 11/27/18 | 14.229 |
| 11/28/18 | 14.143 |
| 11/29/18 | 14.325 |
| 11/30/18 | 14.309 |
| 12/3/18 | 14.27 |
| 12/4/18 | 14.383 |
| 12/5/18 | 14.52 |
| 12/6/18 | 14.507 |
| 12/7/18 | 14.476 |
| 12/10/18 | 14.639 |
| 12/11/18 | 14.548 |
| 12/12/18 | 14.578 |
| 12/13/18 | 14.745 |
| 12/14/18 | 14.762 |
| 12/17/18 | 14.57 |
| 12/18/18 | 14.664 |
| 12/19/18 | 14.64 |
| 12/20/18 | 14.599 |
| 12/21/18 | 14.78 |
| 12/24/18 | 14.714 |
| 12/25/18 | 14.755 |
| 12/26/18 | 14.732 |
| 12/27/18 | 15.056 |
| 12/28/18 | 15.286 |
| 12/31/18 | 15.408 |
| 1/1/19 | 15.496 |
| 1/2/19 | 15.485 |
| 1/3/19 | 15.519 |
| 1/4/19 | 15.736 |
| 1/7/19 | 15.73 |
| 1/8/19 | 15.647 |
| 1/9/19 | 15.654 |
| 1/10/19 | 15.745 |
| 1/11/19 | 15.563 |
| 1/14/19 | 15.598 |
| 1/15/19 | 15.652 |
| 1/16/19 | 15.578 |
| 1/17/19 | 15.592 |
| 1/18/19 | 15.52 |
| 1/21/19 | 15.339 |
| 1/22/19 | 15.274 |
| 1/23/19 | 15.335 |
| 1/24/19 | 15.355 |
| 1/25/19 | 15.318 |
| 1/28/19 | 15.74 |
| 1/29/19 | 15.747 |
| 1/30/19 | 15.844 |
| 1/31/19 | 16.064 |
| 2/1/19 | 16.066 |
| 2/4/19 | 15.926 |
| 2/5/19 | 15.866 |
| 2/6/19 | 15.848 |
| 2/7/19 | 15.667 |
| 2/8/19 | 15.739 |
| 2/11/19 | 15.815 |
| 2/12/19 | 15.706 |
| 2/13/19 | 15.707 |
| 2/14/19 | 15.566 |
| 2/15/19 | 15.625 |
| 2/18/19 | 15.784 |
| 2/19/19 | 15.814 |
| 2/20/19 | 15.996 |
| 2/21/19 | 16.058 |
| 2/22/19 | 15.812 |
| 2/25/19 | 15.926 |
| 2/26/19 | 15.892 |
| 2/27/19 | 15.935 |
| 2/28/19 | 15.741 |
| 3/1/19 | 15.6 |
| 3/4/19 | 15.225 |
| 3/5/19 | 15.085 |
| 3/6/19 | 15.128 |
| 3/7/19 | 15.076 |
| 3/8/19 | 15.026 |
| 3/11/19 | 15.295 |
| 3/12/19 | 15.34 |
| 3/13/19 | 15.44 |
| 3/14/19 | 15.455 |
| 3/15/19 | 15.18 |
| 3/18/19 | 15.295 |
| 3/19/19 | 15.35 |
| 3/20/19 | 15.365 |
| 3/21/19 | 15.48 |
| 3/22/19 | 15.465 |
| 3/25/19 | 15.425 |
| 3/26/19 | 15.55 |
| 3/27/19 | 15.433 |
| 3/28/19 | 15.325 |
| 3/29/19 | 14.995 |
| 4/1/19 | 15.13 |
| 4/2/19 | 15.105 |
| 4/3/19 | 15.12 |
| 4/4/19 | 15.145 |
| 4/5/19 | 15.15 |
| 4/8/19 | 15.115 |
| 4/9/19 | 15.255 |
| 4/10/19 | 15.23 |
| 4/11/19 | 15.245 |
| 4/12/19 | 14.965 |
| 4/15/19 | 14.98 |
| 4/16/19 | 14.985 |
| 4/17/19 | 15.005 |
| 4/18/19 | 14.99 |
| 4/19/19 | 14.955 |
| 4/22/19 | 15.018 |
| 4/23/19 | 15.019 |
| 4/24/19 | 14.83 |
| 4/25/19 | 14.94 |
| 4/26/19 | 14.942 |
| 4/29/19 | 15.078 |
| 4/30/19 | 14.925 |
| 5/1/19 | 14.945 |
| 5/2/19 | 14.69 |
| 5/3/19 | 14.63 |
| 5/6/19 | 14.925 |
| 5/7/19 | 14.915 |
| 5/8/19 | 14.91 |
| 5/9/19 | 14.84 |
| 5/10/19 | 14.77 |
| 5/13/19 | 14.784 |
| 5/14/19 | 14.77 |
| 5/15/19 | 14.796 |
| 5/16/19 | 14.785 |
| 5/17/19 | 14.545 |
| 5/20/19 | 14.408 |
| 5/21/19 | 14.435 |
| 5/22/19 | 14.445 |
| 5/23/19 | 14.42 |
| 5/24/19 | 14.59 |
| 5/27/19 | 14.574 |
| 5/28/19 | 14.585 |
| 5/29/19 | 14.362 |
| 5/30/19 | 14.42 |
| 5/31/19 | 14.525 |
| 6/3/19 | 14.593 |
| 6/4/19 | 14.798 |
| 6/5/19 | 14.827 |
| 6/6/19 | 14.817 |
| 6/7/19 | 14.897 |
| 6/10/19 | 15.015 |
| 6/11/19 | 14.705 |
| 6/12/19 | 14.745 |
| 6/13/19 | 14.785 |
| 6/14/19 | 14.925 |
| 6/17/19 | 14.87 |
| 6/18/19 | 14.845 |
| 6/19/19 | 15.005 |
| 6/20/19 | 15.17 |
| 6/21/19 | 15.445 |
| 6/24/19 | 15.364 |
| 6/25/19 | 15.435 |
| 6/26/19 | 15.362 |
| 6/27/19 | 15.285 |
| 6/28/19 | 15.245 |
| 7/1/19 | 15.335 |
| 7/2/19 | 15.14 |
| 7/3/19 | 15.32 |
| 7/4/19 | 15.328 |
| 7/5/19 | 15.28 |
| 7/8/19 | 15.009 |
| 7/9/19 | 15.03 |
| 7/10/19 | 15.11 |
| 7/11/19 | 15.245 |
| 7/12/19 | 15.105 |
| 7/15/19 | 15.23 |
| 7/16/19 | 15.395 |
| 7/17/19 | 15.565 |
| 7/18/19 | 15.985 |
| 7/19/19 | 16.34 |
| 7/22/19 | 16.245 |
| 7/23/19 | 16.365 |
| 7/24/19 | 16.4 |
| 7/25/19 | 16.585 |
| 7/26/19 | 16.43 |
| 7/29/19 | 16.404 |
| 7/30/19 | 16.475 |
| 7/31/19 | 16.56 |
| 8/1/19 | 16.255 |
| 8/2/19 | 16.32 |
| 8/5/19 | 16.22 |
| 8/6/19 | 16.435 |
| 8/7/19 | 16.445 |
| 8/8/19 | 17.08 |
| 8/9/19 | 16.905 |
| 8/12/19 | 16.958 |
| 8/13/19 | 17.075 |
| 8/14/19 | 16.979 |
| 8/15/19 | 17.21 |
| 8/16/19 | 17.275 |
| 8/19/19 | 17.115 |
| 8/20/19 | 16.885 |
| 8/21/19 | 17.17 |
| 8/22/19 | 17.145 |
| 8/23/19 | 17.04 |
| 8/26/19 | 17.612 |
| 8/27/19 | 17.665 |
| 8/28/19 | 18.18 |
| 8/29/19 | 18.34 |
| 8/30/19 | 18.265 |
| 9/2/19 | 18.43 |
| 9/3/19 | 18.48 |
| 9/4/19 | 19.26 |
| 9/5/19 | 19.58 |
| 9/6/19 | 18.66 |
| 9/9/19 | 18.19 |
| 9/10/19 | 18 |
| 9/11/19 | 18.015 |
| 9/12/19 | 18.1 |
| 9/13/19 | 18.06 |
| 9/16/19 | 17.445 |
| 9/17/19 | 17.845 |
| 9/18/19 | 18.02 |
| 9/19/19 | 17.805 |
| 9/20/19 | 17.79 |
| 9/23/19 | 17.962 |
| 9/24/19 | 18.635 |
| 9/25/19 | 18.625 |
| 9/26/19 | 17.927 |
| 9/27/19 | 17.81 |
| 9/30/19 | 17.529 |
| 10/1/19 | 17.001 |
| 10/2/19 | 17.246 |
| 10/3/19 | 17.583 |
| 10/4/19 | 17.564 |
| 10/7/19 | 17.635 |
| 10/8/19 | 17.453 |
| 10/9/19 | 17.73 |
| 10/10/19 | 17.72 |
| 10/11/19 | 17.51 |
| 10/14/19 | 17.575 |
| 10/15/19 | 17.645 |
| 10/16/19 | 17.419 |
| 10/17/19 | 17.4 |
| 10/18/19 | 17.552 |
| 10/21/19 | 17.565 |
| 10/22/19 | 17.568 |
| 10/23/19 | 17.538 |
| 10/24/19 | 17.567 |
| 10/25/19 | 17.813 |
| 10/28/19 | 18.054 |
| 10/29/19 | 17.855 |
| 10/30/19 | 17.815 |
| 10/31/19 | 17.885 |
| 11/1/19 | 18.115 |
| 11/4/19 | 18.13 |
| 11/5/19 | 18.055 |
| 11/6/19 | 17.59 |
| 11/7/19 | 17.635 |
| 11/8/19 | 17.119 |
| 11/11/19 | 16.81 |
| 11/12/19 | 16.862 |
| 11/13/19 | 16.784 |
| 11/14/19 | 16.964 |
| 11/15/19 | 17.022 |
| 11/18/19 | 16.96 |
| 11/19/19 | 17.035 |
| 11/20/19 | 17.145 |
| 11/21/19 | 17.145 |
| 11/22/19 | 17.107 |
| 11/25/19 | 17.01 |
| 11/26/19 | 16.905 |
| 11/27/19 | 17.078 |
| 11/28/19 | 16.955 |
| 11/29/19 | 16.92 |
| 12/2/19 | 16.995 |
| 12/3/19 | 16.905 |
| 12/4/19 | 17.175 |
| 12/5/19 | 16.848 |
| 12/6/19 | 16.955 |
| 12/9/19 | 16.56 |
| 12/10/19 | 16.625 |
| 12/11/19 | 16.665 |
| 12/12/19 | 16.862 |
| 12/13/19 | 16.93 |
| 12/16/19 | 16.956 |
| 12/17/19 | 17.04 |
| 12/18/19 | 17.012 |
| 12/19/19 | 17.016 |
| 12/20/19 | 17.07 |
| 12/23/19 | 17.2 |
| 12/24/19 | 17.433 |
| 12/26/19 | 17.776 |
| 12/27/19 | 17.897 |
| 12/30/19 | 17.76 |
| 12/31/19 | 17.925 |
| 1/1/20 | 17.85 |
| 1/2/20 | 17.865 |
| 1/3/20 | 18.025 |
| 1/6/20 | 18.04 |
| 1/7/20 | 18.153 |
| 1/8/20 | 18.402 |
| 1/9/20 | 18.095 |
| 1/10/20 | 17.909 |
| 1/13/20 | 18.1 |
| 1/14/20 | 17.974 |
| 1/15/20 | 17.795 |
| 1/16/20 | 18.002 |
| 1/17/20 | 17.951 |
| 1/20/20 | 18.02 |
| 1/21/20 | 18.065 |
| 1/22/20 | 17.791 |
| 1/23/20 | 17.838 |
| 1/24/20 | 17.802 |
| 1/27/20 | 18.11 |
| 1/28/20 | 18.103 |
| 1/29/20 | 17.454 |
| 1/30/20 | 17.559 |
| 1/31/20 | 17.841 |
| 2/3/20 | 18.05 |
| 2/4/20 | 17.675 |
| 2/5/20 | 17.597 |
| 2/6/20 | 17.615 |
| 2/7/20 | 17.828 |
| 2/10/20 | 17.7 |
| 2/11/20 | 17.774 |
| 2/12/20 | 17.652 |
| 2/13/20 | 17.484 |
| 2/14/20 | 17.647 |
| 2/17/20 | 17.75 |
| 2/18/20 | 17.795 |
| 2/19/20 | 18.169 |
| 2/20/20 | 18.423 |
| 2/21/20 | 18.368 |
| 2/24/20 | 18.49 |
| 2/25/20 | 18.642 |
| 2/26/20 | 18.005 |
| 2/27/20 | 17.908 |
| 2/28/20 | 17.724 |
| 3/2/20 | 16.69 |
| 3/3/20 | 16.748 |
| 3/4/20 | 17.197 |
| 3/5/20 | 17.208 |
| 3/6/20 | 17.43 |
| 3/9/20 | 17.335 |
| 3/10/20 | 16.99 |
| 3/11/20 | 16.897 |
| 3/12/20 | 16.75 |
| 3/13/20 | 15.838 |
| 3/16/20 | 15.094 |
| 3/17/20 | 12.845 |
| 3/18/20 | 12.61 |
| 3/19/20 | 11.96 |
| 3/20/20 | 12.097 |
| 3/23/20 | 12.6 |
| 3/24/20 | 13.28 |
| 3/25/20 | 14.31 |
| 3/26/20 | 14.5 |
| 3/27/20 | 14.405 |
| 3/30/20 | 14.535 |
| 3/31/20 | 14.057 |
| 4/1/20 | 13.97 |
| 4/2/20 | 13.948 |
| 4/3/20 | 14.496 |
| 4/6/20 | 14.407 |
| 4/7/20 | 15.02 |
| 4/8/20 | 15.011 |
| 4/9/20 | 14.974 |
| 4/10/20 | 15.44 |
| 4/13/20 | 15.474 |
| 4/14/20 | 15.361 |
| 4/15/20 | 15.759 |
| 4/16/20 | 15.487 |
| 4/17/20 | 15.545 |
| 4/20/20 | 15.146 |
| 4/21/20 | 15.318 |
| 4/22/20 | 14.88 |
| 4/23/20 | 15.093 |
| 4/24/20 | 15.255 |
| 4/27/20 | 15.259 |
| 4/28/20 | 15.202 |
| 4/29/20 | 15.194 |
| 4/30/20 | 15.27 |
| 5/1/20 | 14.948 |
| 5/4/20 | 14.974 |
| 5/5/20 | 14.798 |
| 5/6/20 | 14.966 |
| 5/7/20 | 14.842 |
| 5/8/20 | 15.35 |
| 5/11/20 | 15.505 |
| 5/12/20 | 15.493 |
| 5/13/20 | 15.446 |
| 5/14/20 | 15.562 |
| 5/15/20 | 15.875 |
| 5/18/20 | 16.635 |
| 5/19/20 | 16.995 |
| 5/20/20 | 17.44 |
| 5/21/20 | 17.51 |
| 5/22/20 | 17.01 |
| 5/25/20 | 17.202 |
| 5/26/20 | 17.123 |
| 5/27/20 | 17.12 |
| 5/28/20 | 17.276 |
| 5/29/20 | 17.43 |
| 6/1/20 | 17.885 |
| 6/2/20 | 18.285 |
| 6/3/20 | 18.1 |
| 6/4/20 | 17.75 |
| 6/5/20 | 17.76 |
| 6/8/20 | 17.386 |
| 6/9/20 | 17.761 |
| 6/10/20 | 17.533 |
| 6/11/20 | 18.124 |
| 6/12/20 | 17.615 |
| 6/15/20 | 17.457 |
| 6/16/20 | 17.378 |
| 6/17/20 | 17.43 |
| 6/18/20 | 17.485 |
| 6/19/20 | 17.53 |
| 6/22/20 | 17.654 |
| 6/23/20 | 17.84 |
| 6/24/20 | 17.86 |
| 6/25/20 | 17.482 |
| 6/26/20 | 17.797 |
| 6/29/20 | 17.814 |
| 6/30/20 | 17.82 |
| 7/1/20 | 18.17 |
| 7/2/20 | 17.96 |
| 7/3/20 | 18.05 |
| 7/6/20 | 18.048 |
| 7/7/20 | 18.245 |
| 7/8/20 | 18.34 |
| 7/9/20 | 18.645 |
| 7/10/20 | 18.695 |
| 7/13/20 | 18.692 |
| 7/14/20 | 19.115 |
| 7/15/20 | 19.205 |
| 7/16/20 | 19.425 |
| 7/17/20 | 19.155 |
| 7/20/20 | 19.354 |
| 7/21/20 | 19.93 |
| 7/22/20 | 21.303 |
| 7/23/20 | 23.065 |
| 7/24/20 | 22.695 |
| 7/27/20 | 22.745 |
| 7/28/20 | 24.564 |
| 7/29/20 | 24.605 |
| 7/30/20 | 24.415 |
| 7/31/20 | 23.526 |
| 8/3/20 | 24.76 |
| 8/4/20 | 24.245 |
| 8/5/20 | 26.015 |
| 8/6/20 | 26.991 |
| 8/7/20 | 28.935 |
| 8/10/20 | 28.463 |
| 8/11/20 | 29.185 |
| 8/12/20 | 24.782 |
| 8/13/20 | 25.584 |
| 8/14/20 | 27.523 |
| 8/17/20 | 26.642 |
| 8/18/20 | 27.455 |
| 8/19/20 | 27.723 |
| 8/20/20 | 26.715 |
| 8/21/20 | 27.264 |
| 8/24/20 | 26.764 |
| 8/25/20 | 26.545 |
| 8/26/20 | 26.475 |
| 8/27/20 | 27.519 |
| 8/28/20 | 27.053 |
| 8/31/20 | 27.538 |
| 9/1/20 | 28.265 |
| 9/2/20 | 28.124 |
| 9/3/20 | 27.432 |
| 9/4/20 | 26.59 |
| 9/7/20 | 26.875 |
| 9/8/20 | 26.934 |
| 9/9/20 | 26.627 |
| 9/10/20 | 26.989 |
| 9/11/20 | 26.878 |
| 9/14/20 | 26.765 |
| 9/15/20 | 27.147 |
| 9/16/20 | 27.235 |
| 9/17/20 | 27.315 |
| 9/18/20 | 27.085 |
| 9/21/20 | 26.797 |
| 9/22/20 | 24.725 |
| 9/23/20 | 24.4 |
| 9/24/20 | 22.895 |
| 9/25/20 | 23.155 |
| 9/28/20 | 22.876 |
| 9/29/20 | 23.675 |
| 9/30/20 | 24.224 |
| 10/1/20 | 23.225 |
| 10/2/20 | 23.784 |
| 10/5/20 | 23.715 |
| 10/6/20 | 24.385 |
| 10/7/20 | 23.035 |
| 10/8/20 | 23.875 |
| 10/9/20 | 23.845 |
| 10/12/20 | 25.11 |
| 10/13/20 | 25.135 |
| 10/14/20 | 24.165 |
| 10/15/20 | 24.288 |
| 10/16/20 | 24.275 |
| 10/19/20 | 24.175 |
| 10/20/20 | 24.38 |
| 10/21/20 | 24.655 |
| 10/22/20 | 25.04 |
| 10/23/20 | 24.72 |
| 10/26/20 | 24.63 |
| 10/27/20 | 24.275 |
| 10/28/20 | 24.37 |
| 10/29/20 | 23.39 |
| 10/30/20 | 23.245 |
| 11/2/20 | 23.655 |
| 11/3/20 | 24.08 |
| 11/4/20 | 24.18 |
| 11/5/20 | 23.94 |
| 11/6/20 | 25.36 |
| 11/9/20 | 25.615 |
| 11/10/20 | 24.085 |
| 11/11/20 | 24.22 |
| 11/12/20 | 24.275 |
| 11/13/20 | 24.245 |
| 11/16/20 | 24.675 |
| 11/17/20 | 24.78 |
| 11/18/20 | 24.492 |
| 11/19/20 | 24.315 |
| 11/20/20 | 24.095 |
| 11/23/20 | 24.165 |
| 11/24/20 | 23.59 |
| 11/25/20 | 23.27 |
| 11/26/20 | 23.325 |
| 11/27/20 | 23.275 |
| 11/30/20 | 22.725 |
| 12/1/20 | 22.635 |
| 12/2/20 | 24.015 |
| 12/3/20 | 24.11 |
| 12/4/20 | 24.085 |
| 12/7/20 | 24.19 |
| 12/8/20 | 24.505 |
| 12/9/20 | 24.56 |
| 12/10/20 | 23.944 |
| 12/11/20 | 23.975 |
| 12/14/20 | 23.935 |
| 12/15/20 | 23.84 |
| 12/16/20 | 24.52 |
| 12/17/20 | 25.375 |
| 12/18/20 | 26.06 |
| 12/21/20 | 25.795 |
| 12/22/20 | 26.191 |
| 12/23/20 | 25.16 |
| 12/24/20 | 25.56 |
| 12/25/20 | 25.825 |
| 12/28/20 | 26.09 |
| 12/29/20 | 26.205 |
| 12/30/20 | 26.21 |
| 12/31/20 | 26.64 |
| 1/1/21 | 26.4 |
| 1/4/21 | 26.65 |
| 1/5/21 | 27.245 |
| 1/6/21 | 27.58 |
| 1/7/21 | 27.305 |
| 1/8/21 | 27.125 |
| 1/11/21 | 25.355 |
| 1/12/21 | 24.96 |
| 1/13/21 | 25.605 |
| 1/14/21 | 25.155 |
| 1/15/21 | 25.545 |
| 1/18/21 | 24.784 |
| 1/19/21 | 25.345 |
| 1/20/21 | 25.2 |
| 1/21/21 | 25.835 |
| 1/22/21 | 25.965 |
| 1/25/21 | 25.425 |
| 1/26/21 | 25.34 |
| 1/27/21 | 25.47 |
| 1/28/21 | 25.268 |
| 1/29/21 | 26.385 |
| 2/1/21 | 28.295 |
| 2/2/21 | 29 |
| 2/3/21 | 26.615 |
| 2/4/21 | 26.87 |
| 2/5/21 | 26.3 |
| 2/8/21 | 26.98 |
| 2/9/21 | 27.26 |
| 2/10/21 | 27.245 |
| 2/11/21 | 27.005 |
| 2/12/21 | 26.98 |
| 2/15/21 | 27.395 |
| 2/16/21 | 27.605 |
| 2/17/21 | 27.26 |
| 2/18/21 | 27.39 |
| 2/19/21 | 27.025 |
| 2/22/21 | 27.385 |
| 2/23/21 | 28.175 |
| 2/24/21 | 27.64 |
| 2/25/21 | 28.015 |
| 2/26/21 | 27.42 |
| 3/1/21 | 26.65 |
| 3/2/21 | 26.52 |
| 3/3/21 | 26.78 |
| 3/4/21 | 26.125 |
| 3/5/21 | 25.32 |
| 3/8/21 | 25.35 |
| 3/9/21 | 25.11 |
| 3/10/21 | 25.92 |
| 3/11/21 | 26.205 |
| 3/12/21 | 26.09 |
| 3/15/21 | 25.975 |
| 3/16/21 | 26.25 |
| 3/17/21 | 25.95 |
| 3/18/21 | 26.31 |
| 3/19/21 | 26.07 |
| 3/22/21 | 26.232 |
| 3/23/21 | 25.76 |
| 3/24/21 | 25.07 |
| 3/25/21 | 25.09 |
| 3/26/21 | 25.075 |
| 3/29/21 | 25.078 |
| 3/30/21 | 24.665 |
| 3/31/21 | 24.03 |
| 4/1/21 | 24.434 |
| 4/2/21 | 24.98 |
| 4/5/21 | 25 |
| 4/6/21 | 24.875 |
| 4/7/21 | 25.145 |
| 4/8/21 | 25.157 |
| 4/9/21 | 25.46 |
| 4/12/21 | 25.25 |
| 4/13/21 | 24.8 |
| 4/14/21 | 25.355 |
| 4/15/21 | 25.425 |
| 4/16/21 | 25.85 |
| 4/19/21 | 25.985 |
| 4/20/21 | 25.82 |
| 4/21/21 | 25.833 |
| 4/22/21 | 26.575 |
| 4/23/21 | 26.17 |
| 4/26/21 | 25.99 |
| 4/27/21 | 26.216 |
| 4/28/21 | 26.302 |
| 4/29/21 | 26.24 |
| 4/30/21 | 26.11 |
| 5/3/21 | 25.925 |
| 5/4/21 | 26.92 |
| 5/5/21 | 26.515 |
| 5/6/21 | 26.515 |
| 5/7/21 | 27.3 |
| 5/10/21 | 27.545 |
| 5/11/21 | 27.334 |
| 5/12/21 | 27.635 |
| 5/13/21 | 27.02 |
| 5/14/21 | 27.095 |
| 5/17/21 | 27.48 |
| 5/18/21 | 28.19 |
| 5/19/21 | 28.195 |
| 5/20/21 | 27.735 |
| 5/21/21 | 27.764 |
| 5/24/21 | 27.57 |
| 5/25/21 | 27.774 |
| 5/26/21 | 27.995 |
| 5/27/21 | 27.68 |
| 5/28/21 | 27.875 |
| 5/31/21 | 27.93 |
| 6/1/21 | 28.062 |
| 6/2/21 | 27.885 |
| 6/3/21 | 28.16 |
| 6/4/21 | 27.44 |
| 6/7/21 | 27.85 |
| 6/8/21 | 27.88 |
| 6/9/21 | 27.627 |
| 6/10/21 | 27.772 |
| 6/11/21 | 27.99 |
| 6/14/21 | 27.936 |
| 6/15/21 | 27.854 |
| 6/16/21 | 27.662 |
| 6/17/21 | 26.988 |
| 6/18/21 | 25.885 |
| 6/21/21 | 25.81 |
| 6/22/21 | 25.96 |
| 6/23/21 | 25.774 |
| 6/24/21 | 25.887 |
| 6/25/21 | 25.954 |
| 6/28/21 | 26.12 |
| 6/29/21 | 26.126 |
| 6/30/21 | 25.77 |
| 7/1/21 | 26.123 |
| 7/2/21 | 26.036 |
| 7/5/21 | 26.496 |
| 7/6/21 | 26.448 |
| 7/7/21 | 26.16 |
| 7/8/21 | 26.146 |
| 7/9/21 | 25.931 |
| 7/12/21 | 26.098 |
| 7/13/21 | 26.2 |
| 7/14/21 | 25.986 |
| 7/15/21 | 26.246 |
| 7/16/21 | 26.345 |
| 7/19/21 | 25.679 |
| 7/20/21 | 25.172 |
| 7/21/21 | 24.933 |
| 7/22/21 | 25.252 |
| 7/23/21 | 25.431 |
| 7/26/21 | 25.19 |
| 7/27/21 | 25.189 |
| 7/28/21 | 24.695 |
| 7/29/21 | 24.952 |
| 7/30/21 | 25.527 |
| 8/2/21 | 25.54 |
| 8/3/21 | 25.416 |
| 8/4/21 | 25.524 |
| 8/5/21 | 25.382 |
| 8/6/21 | 25.156 |
| 8/9/21 | 24.32 |
| 8/10/21 | 23.452 |
| 8/11/21 | 23.34 |
| 8/12/21 | 23.545 |
| 8/13/21 | 23.174 |
| 8/16/21 | 23.76 |
| 8/17/21 | 23.843 |
| 8/18/21 | 23.66 |
| 8/19/21 | 23.506 |
| 8/20/21 | 23.254 |
| 8/23/21 | 23.026 |
| 8/24/21 | 23.633 |
| 8/25/21 | 23.86 |
| 8/26/21 | 23.848 |
| 8/27/21 | 23.566 |
| 8/30/21 | 24.015 |
| 8/31/21 | 24.02 |
| 9/1/21 | 23.906 |
| 9/2/21 | 24.15 |
| 9/3/21 | 23.906 |
| 9/6/21 | 24.762 |
| 9/7/21 | 24.7 |
| 9/8/21 | 24.323 |
| 9/9/21 | 23.948 |
| 9/10/21 | 24.034 |
| 9/13/21 | 23.755 |
| 9/14/21 | 23.73 |
| 9/15/21 | 23.853 |
| 9/16/21 | 23.844 |
| 9/17/21 | 22.931 |
| 9/20/21 | 22.355 |
| 9/21/21 | 22.269 |
| 9/22/21 | 22.497 |
| 9/23/21 | 22.694 |
| 9/24/21 | 22.512 |
| 9/27/21 | 22.416 |
| 9/28/21 | 22.61 |
| 9/29/21 | 22.456 |
| 9/30/21 | 21.538 |
| 10/1/21 | 22.166 |
| 10/4/21 | 22.57 |
| 10/5/21 | 22.684 |
| 10/6/21 | 22.632 |
| 10/7/21 | 22.618 |
| 10/8/21 | 22.605 |
| 10/11/21 | 22.681 |
| 10/12/21 | 22.576 |
| 10/13/21 | 22.558 |
| 10/14/21 | 23.09 |
| 10/15/21 | 23.515 |
| 10/18/21 | 23.328 |
| 10/19/21 | 23.19 |
| 10/20/21 | 23.666 |
| 10/21/21 | 24.292 |
| 10/22/21 | 24.16 |
| 10/25/21 | 24.345 |
| 10/26/21 | 24.565 |
| 10/27/21 | 24.16 |
| 10/28/21 | 24.062 |
| 10/29/21 | 24.08 |
| 11/1/21 | 23.915 |
| 11/2/21 | 24.041 |
| 11/3/21 | 23.54 |
| 11/4/21 | 23.518 |
| 11/5/21 | 23.796 |
| 11/8/21 | 24.18 |
| 11/9/21 | 24.47 |
| 11/10/21 | 24.305 |
| 11/11/21 | 24.645 |
| 11/12/21 | 25.25 |
| 11/15/21 | 25.315 |
| 11/16/21 | 25.065 |
| 11/17/21 | 24.83 |
| 11/18/21 | 25.068 |
| 11/19/21 | 24.79 |
| 11/22/21 | 24.635 |
| 11/23/21 | 24.195 |
| 11/24/21 | 23.68 |
| 11/25/21 | 23.55 |
| 11/26/21 | 23.6 |
| 11/29/21 | 23.145 |
| 11/30/21 | 22.915 |
| 12/1/21 | 22.82 |
| 12/2/21 | 22.31 |
| 12/3/21 | 22.39 |
| 12/6/21 | 22.586 |
| 12/7/21 | 22.377 |
| 12/8/21 | 22.502 |
| 12/9/21 | 22.41 |
| 12/10/21 | 21.955 |
| 12/13/21 | 22.18 |
| 12/14/21 | 22.33 |
| 12/15/21 | 21.946 |
| 12/16/21 | 22.08 |
| 12/17/21 | 22.49 |
| 12/20/21 | 22.41 |
| 12/21/21 | 22.26 |
| 12/22/21 | 22.52 |
| 12/23/21 | 22.798 |
| 12/24/21 | 22.905 |
| 12/27/21 | 22.855 |
| 12/28/21 | 23.075 |
| 12/29/21 | 23.01 |
| 12/30/21 | 22.824 |
| 12/31/21 | 23.055 |
| 1/3/22 | 23.325 |
| 1/4/22 | 22.895 |
| 1/5/22 | 23.055 |
| 1/6/22 | 22.798 |
| 1/7/22 | 22.18 |
| 1/10/22 | 22.358 |
| 1/11/22 | 22.475 |
| 1/12/22 | 22.785 |
| 1/13/22 | 23.13 |
| 1/14/22 | 23.09 |
| 1/17/22 | 22.96 |
| 1/18/22 | 23.025 |
| 1/19/22 | 23.47 |
| 1/20/22 | 24.149 |
| 1/21/22 | 24.45 |
| 1/24/22 | 24.28 |
| 1/25/22 | 23.99 |
| 1/26/22 | 23.82 |
| 1/27/22 | 23.495 |
| 1/28/22 | 22.776 |
| 1/31/22 | 22.455 |
| 2/1/22 | 22.459 |
| 2/2/22 | 22.655 |
| 2/3/22 | 22.645 |
| 2/4/22 | 22.41 |
| 2/7/22 | 22.48 |
| 2/8/22 | 23.015 |
| 2/9/22 | 23.2 |
| 2/10/22 | 23.31 |
| 2/11/22 | 23.203 |
| 2/14/22 | 23.61 |
| 2/15/22 | 23.86 |
| 2/16/22 | 23.37 |
| 2/17/22 | 23.575 |
| 2/18/22 | 23.84 |
| 2/21/22 | 24.015 |
| 2/22/22 | 23.965 |
| 2/23/22 | 24.105 |
| 2/24/22 | 24.55 |
| 2/25/22 | 24.2 |
| 2/28/22 | 24.732 |
| 3/1/22 | 24.46 |
| 3/2/22 | 25.393 |
| 3/3/22 | 25.285 |
| 3/4/22 | 25.185 |
| 3/7/22 | 25.85 |
| 3/8/22 | 25.68 |
| 3/9/22 | 26.415 |
| 3/10/22 | 25.76 |
| 3/11/22 | 25.907 |
| 3/14/22 | 25.9 |
| 3/15/22 | 25.036 |
| 3/16/22 | 24.886 |
| 3/17/22 | 25.085 |
| 3/18/22 | 25.376 |
| 3/21/22 | 24.956 |
| 3/22/22 | 25.218 |
| 3/23/22 | 24.784 |
| 3/24/22 | 25.105 |
| 3/25/22 | 25.537 |
| 3/28/22 | 25.53 |
| 3/29/22 | 24.85 |
| 3/30/22 | 24.773 |
| 3/31/22 | 24.866 |
| 4/1/22 | 24.805 |
| 4/4/22 | 24.625 |
| 4/5/22 | 24.56 |
| 4/6/22 | 24.336 |
| 4/7/22 | 24.455 |
| 4/8/22 | 24.615 |
| 4/11/22 | 24.8 |
| 4/12/22 | 25.15 |
| 4/13/22 | 25.372 |
| 4/14/22 | 25.725 |
| 4/15/22 | 25.675 |
| 4/18/22 | 25.64 |
| 4/19/22 | 25.863 |
| 4/20/22 | 25.179 |
| 4/21/22 | 25.2 |
| 4/22/22 | 24.66 |
| 4/25/22 | 24.145 |
| 4/26/22 | 23.625 |
| 4/27/22 | 23.505 |
| 4/28/22 | 23.285 |
| 4/29/22 | 23.154 |
| 5/2/22 | 22.77 |
| 5/3/22 | 22.65 |
| 5/4/22 | 22.574 |
| 5/5/22 | 23.002 |
| 5/6/22 | 22.528 |
| 5/9/22 | 22.33 |
| 5/10/22 | 21.79 |
| 5/11/22 | 21.27 |
| 5/12/22 | 21.565 |
| 5/13/22 | 20.69 |
| 5/16/22 | 21.105 |
| 5/17/22 | 21.622 |
| 5/18/22 | 21.634 |
| 5/19/22 | 21.421 |
| 5/20/22 | 21.925 |
| 5/23/22 | 21.77 |
| 5/24/22 | 21.805 |
| 5/25/22 | 22.12 |
| 5/26/22 | 21.994 |
| 5/27/22 | 22.015 |
| 5/30/22 | 22.12 |
| 5/31/22 | 21.98 |
| 6/1/22 | 21.564 |
| 6/2/22 | 21.836 |
| 6/3/22 | 22.304 |
| 6/6/22 | 21.915 |
| 6/7/22 | 22.08 |
| 6/8/22 | 22.23 |
| 6/9/22 | 22.057 |
| 6/10/22 | 21.686 |
| 6/13/22 | 21.93 |
| 6/14/22 | 21.078 |
| 6/15/22 | 21.055 |
| 6/16/22 | 21.678 |
| 6/17/22 | 21.949 |
| 6/20/22 | 21.65 |
| 6/21/22 | 21.588 |
| 6/22/22 | 21.69 |
| 6/23/22 | 21.414 |
| 6/24/22 | 20.96 |
| 6/27/22 | 21.25 |
| 6/28/22 | 21.173 |
| 6/29/22 | 20.8 |
| 6/30/22 | 20.733 |
| 7/1/22 | 20.272 |
| 7/4/22 | 19.888 |
| 7/5/22 | 19.96 |
| 7/6/22 | 19.218 |
| 7/7/22 | 19.206 |
| 7/8/22 | 19.218 |
| 7/11/22 | 19.312 |
| 7/12/22 | 19.108 |
| 7/13/22 | 18.933 |
| 7/14/22 | 19.214 |
| 7/15/22 | 18.406 |
| 7/18/22 | 18.71 |
| 7/19/22 | 18.697 |
| 7/20/22 | 18.774 |
| 7/21/22 | 18.678 |
| 7/22/22 | 18.864 |
| 7/25/22 | 18.6 |
| 7/26/22 | 18.439 |
| 7/27/22 | 18.626 |
| 7/28/22 | 19.11 |
| 7/29/22 | 20 |
| 8/1/22 | 20.323 |
| 8/2/22 | 20.364 |
| 8/3/22 | 19.979 |
| 8/4/22 | 20.063 |
| 8/5/22 | 20.175 |
| 8/8/22 | 19.9 |
| 8/9/22 | 20.674 |
| 8/10/22 | 20.53 |
| 8/11/22 | 20.593 |
| 8/12/22 | 20.316 |
| 8/15/22 | 20.795 |
| 8/16/22 | 20.28 |
| 8/17/22 | 20.142 |
| 8/18/22 | 19.875 |
| 8/19/22 | 19.565 |
| 8/22/22 | 19.04 |
| 8/23/22 | 18.99 |
| 8/24/22 | 19.13 |
| 8/25/22 | 19.127 |
| 8/26/22 | 19.255 |
| 8/29/22 | 18.881 |
| 8/30/22 | 18.789 |
| 8/31/22 | 18.415 |
| 9/1/22 | 17.975 |
| 9/2/22 | 17.81 |
| 9/5/22 | 18.055 |
| 9/6/22 | 18.15 |
| 9/7/22 | 18.02 |
| 9/8/22 | 18.456 |
| 9/9/22 | 18.64 |
| 9/12/22 | 18.86 |
| 9/13/22 | 19.82 |
| 9/14/22 | 19.34 |
| 9/15/22 | 19.62 |
| 9/16/22 | 19.165 |
| 9/19/22 | 19.55 |
| 9/20/22 | 19.57 |
| 9/21/22 | 19.275 |
| 9/22/22 | 19.586 |
| 9/23/22 | 19.635 |
| 9/26/22 | 18.89 |
| 9/27/22 | 18.33 |
| 9/28/22 | 18.401 |
| 9/29/22 | 18.905 |
| 9/30/22 | 18.822 |
| 10/3/22 | 19.02 |
| 10/4/22 | 20.685 |
| 10/5/22 | 21.057 |
| 10/6/22 | 20.69 |
| 10/7/22 | 20.666 |
| 10/10/22 | 20.18 |
| 10/11/22 | 19.62 |
| 10/12/22 | 19.175 |
| 10/13/22 | 19.05 |
| 10/14/22 | 18.88 |
| 10/17/22 | 18.23 |
| 10/18/22 | 18.7 |
| 10/19/22 | 18.745 |
| 10/20/22 | 18.515 |
| 10/21/22 | 18.735 |
| 10/24/22 | 19.427 |
| 10/25/22 | 19.24 |
| 10/26/22 | 19.345 |
| 10/27/22 | 19.59 |
| 10/28/22 | 19.605 |
| 10/31/22 | 19.24 |
| 11/1/22 | 19.166 |
| 11/2/22 | 19.625 |
| 11/3/22 | 19.23 |
| 11/4/22 | 19.47 |
| 11/7/22 | 20.49 |
| 11/8/22 | 20.81 |
| 11/9/22 | 21.365 |
| 11/10/22 | 21.04 |
| 11/11/22 | 21.68 |
| 11/14/22 | 21.7 |
| 11/15/22 | 21.986 |
| 11/16/22 | 21.565 |
| 11/17/22 | 21.478 |
| 11/18/22 | 20.948 |
| 11/21/22 | 20.953 |
| 11/22/22 | 20.844 |
| 11/23/22 | 21.082 |
| 11/24/22 | 21.535 |
| 11/25/22 | 21.506 |
| 11/28/22 | 21.405 |
| 11/29/22 | 20.934 |
| 11/30/22 | 21.26 |
| 12/1/22 | 22.198 |
| 12/2/22 | 22.768 |
| 12/5/22 | 23.117 |
| 12/6/22 | 22.262 |
| 12/7/22 | 22.192 |
| 12/8/22 | 22.727 |
| 12/9/22 | 23.068 |
| 12/12/22 | 23.46 |
| 12/13/22 | 23.302 |
| 12/14/22 | 23.731 |
| 12/15/22 | 23.919 |
| 12/16/22 | 23.073 |
| 12/19/22 | 23.23 |
| 12/20/22 | 22.967 |
| 12/21/22 | 24.168 |
| 12/22/22 | 23.971 |
| 12/23/22 | 23.552 |
| 12/26/22 | 23.91 |
| 12/27/22 | 23.839 |
| 12/28/22 | 24.046 |
| 12/29/22 | 23.529 |
| 12/30/22 | 23.892 |
| 1/2/23 | 23.97 |
| 1/3/23 | 24.064 |
| 1/4/23 | 24.005 |
| 1/5/23 | 23.76 |
| 1/6/23 | 23.245 |
| 1/9/23 | 23.861 |
| 1/10/23 | 23.63 |
| 1/11/23 | 23.61 |
| 1/12/23 | 23.421 |
| 1/13/23 | 23.78 |
| 1/16/23 | 24.305 |
| 1/17/23 | 24.405 |
| 1/18/23 | 23.922 |
| 1/19/23 | 23.452 |
| 1/20/23 | 23.832 |
| 1/23/23 | 23.962 |
| 1/24/23 | 23.454 |
| 1/25/23 | 23.669 |
| 1/26/23 | 23.904 |
| 1/27/23 | 23.917 |
| 1/30/23 | 23.595 |
| 1/31/23 | 23.592 |
| 2/1/23 | 23.725 |
| 2/2/23 | 23.982 |
| 2/3/23 | 23.472 |
| 2/6/23 | 22.338 |
| 2/7/23 | 22.266 |
| 2/8/23 | 22.19 |
| 2/9/23 | 22.311 |
| 2/10/23 | 21.978 |
| 2/13/23 | 22.003 |
| 2/14/23 | 21.972 |
| 2/15/23 | 21.859 |
| 2/16/23 | 21.64 |
| 2/17/23 | 21.6 |
| 2/20/23 | 21.67 |
| 2/21/23 | 21.778 |
| 2/22/23 | 21.829 |
| 2/23/23 | 21.505 |
| 2/24/23 | 21.323 |
| 2/27/23 | 20.796 |
| 2/28/23 | 20.626 |
| 3/1/23 | 20.915 |
| 3/2/23 | 20.999 |
| 3/3/23 | 20.899 |
| 3/6/23 | 21.308 |
| 3/7/23 | 21.043 |
| 3/8/23 | 20.081 |
| 3/9/23 | 20.019 |
| 3/10/23 | 20.072 |
| 3/13/23 | 20.7 |
| 3/14/23 | 21.803 |
| 3/15/23 | 21.686 |
| 3/16/23 | 21.788 |
| 3/17/23 | 21.715 |
| 3/20/23 | 22.59 |
| 3/21/23 | 22.514 |
| 3/22/23 | 22.384 |
| 3/23/23 | 22.983 |
| 3/24/23 | 23.118 |
| 3/27/23 | 23.275 |
| 3/28/23 | 23.09 |
| 3/29/23 | 23.29 |
| 3/30/23 | 23.303 |
| 3/31/23 | 23.822 |
| 4/3/23 | 24.13 |
| 4/4/23 | 23.985 |
| 4/5/23 | 24.991 |
| 4/6/23 | 24.993 |
| 4/10/23 | 24.904 |
| 4/11/23 | 24.914 |
| 4/12/23 | 25.123 |
| 4/13/23 | 25.49 |
| 4/14/23 | 25.804 |
| 4/17/23 | 25.309 |
| 4/18/23 | 25.07 |
| 4/19/23 | 25.207 |
| 4/20/23 | 25.245 |
| 4/21/23 | 25.242 |
| 4/24/23 | 25.067 |
| 4/25/23 | 25.116 |
| 4/26/23 | 24.956 |
| 4/27/23 | 24.884 |
| 4/28/23 | 24.865 |
| 5/1/23 | 25.162 |
| 5/2/23 | 24.96 |
| 5/3/23 | 25.385 |
| 5/4/23 | 25.539 |
| 5/5/23 | 26.017 |
| 5/8/23 | 25.676 |
| 5/9/23 | 25.524 |
| 5/10/23 | 25.598 |
| 5/11/23 | 25.481 |
| 5/12/23 | 24.15 |
| 5/15/23 | 23.915 |
| 5/16/23 | 24.143 |
| 5/17/23 | 23.737 |
| 5/18/23 | 23.69 |
| 5/19/23 | 23.47 |
| 5/22/23 | 23.857 |
| 5/23/23 | 23.667 |
| 5/24/23 | 23.453 |
| 5/25/23 | 23.081 |
| 5/26/23 | 22.735 |
| 5/29/23 | 23.25 |
| 5/30/23 | 23.172 |
| 5/31/23 | 23.209 |
| 6/1/23 | 23.546 |
| 6/2/23 | 23.878 |
| 6/5/23 | 23.594 |
| 6/6/23 | 23.555 |
| 6/7/23 | 23.619 |
| 6/8/23 | 23.464 |
| 6/9/23 | 24.294 |
| 6/12/23 | 24.266 |
| 6/13/23 | 24.061 |
| 6/14/23 | 23.628 |
| 6/15/23 | 23.944 |
| 6/16/23 | 23.875 |
| 6/19/23 | 24.168 |
| 6/20/23 | 23.935 |
| 6/21/23 | 23.209 |
| 6/22/23 | 22.623 |
| 6/23/23 | 22.241 |
| 6/26/23 | 22.445 |
| 6/27/23 | 22.769 |
| 6/28/23 | 22.848 |
| 6/29/23 | 22.721 |
| 6/30/23 | 22.571 |
| 7/3/23 | 22.778 |
| 7/4/23 | 22.91 |
| 7/5/23 | 22.958 |
| 7/6/23 | 23.158 |
| 7/7/23 | 22.725 |
| 7/10/23 | 23.089 |
| 7/11/23 | 23.177 |
| 7/12/23 | 23.192 |
| 7/13/23 | 24.155 |
| 7/14/23 | 24.847 |
| 7/17/23 | 24.925 |
| 7/18/23 | 24.83 |
| 7/19/23 | 25.063 |
| 7/20/23 | 25.151 |
| 7/21/23 | 24.793 |
| 7/24/23 | 24.62 |
| 7/25/23 | 24.373 |
| 7/26/23 | 24.65 |
| 7/27/23 | 24.916 |
| 7/28/23 | 24.128 |
| 7/31/23 | 24.335 |
| 8/1/23 | 24.748 |
| 8/2/23 | 24.347 |
| 8/3/23 | 23.725 |
| 8/4/23 | 23.58 |
| 8/7/23 | 23.652 |
| 8/8/23 | 23.078 |
| 8/9/23 | 22.761 |
| 8/10/23 | 22.686 |
| 8/11/23 | 22.719 |
| 8/14/23 | 22.7 |
| 8/15/23 | 22.592 |
| 8/16/23 | 22.545 |
| 8/17/23 | 22.434 |
| 8/18/23 | 22.712 |
| 8/21/23 | 22.725 |
| 8/22/23 | 23.321 |
| 8/23/23 | 23.418 |
| 8/24/23 | 24.345 |
| 8/25/23 | 24.158 |
| 8/28/23 | 24.24 |
| 8/29/23 | 24.221 |
| 8/30/23 | 24.73 |
| 8/31/23 | 24.628 |
| 9/1/23 | 24.402 |
| 9/4/23 | 24.188 |
| 9/5/23 | 24.004 |
| 9/6/23 | 23.569 |
| 9/7/23 | 23.173 |
| 9/8/23 | 22.975 |
| 9/11/23 | 22.917 |
| 9/12/23 | 23.045 |
| 9/13/23 | 23.102 |
| 9/14/23 | 22.832 |
| 9/15/23 | 22.658 |
| 9/18/23 | 23.065 |
| 9/19/23 | 23.275 |
| 9/20/23 | 23.278 |
| 9/21/23 | 23.282 |
| 9/22/23 | 23.426 |
| 9/25/23 | 23.545 |
| 9/26/23 | 23.127 |
| 9/27/23 | 22.84 |
| 9/28/23 | 22.57 |
| 9/29/23 | 22.624 |
| 10/2/23 | 22.183 |
| 10/3/23 | 21.093 |
| 10/4/23 | 21.138 |
| 10/5/23 | 21.026 |
| 10/6/23 | 20.922 |
| 10/9/23 | 21.615 |
| 10/10/23 | 21.846 |
| 10/11/23 | 21.843 |
| 10/12/23 | 22.048 |
| 10/13/23 | 21.844 |
| 10/16/23 | 22.75 |
| 10/17/23 | 22.644 |
| 10/18/23 | 22.819 |
| 10/19/23 | 22.826 |
| 10/20/23 | 23.024 |
| 10/23/23 | 22.986 |
| 10/24/23 | 22.958 |
| 10/25/23 | 22.913 |
| 10/26/23 | 22.845 |
| 10/27/23 | 22.76 |
| 10/30/23 | 23.116 |
| 10/31/23 | 23.287 |
| 11/1/23 | 22.96 |
| 11/2/23 | 22.94 |
| 11/3/23 | 22.775 |
| 11/6/23 | 23.225 |
| 11/7/23 | 23.031 |
| 11/8/23 | 22.612 |
| 11/9/23 | 22.542 |
| 11/10/23 | 22.631 |
| 11/13/23 | 22.235 |
| 11/14/23 | 22.325 |
| 11/15/23 | 23.086 |
| 11/16/23 | 23.435 |
| 11/17/23 | 23.721 |
| 11/20/23 | 23.755 |
| 11/21/23 | 23.434 |
| 11/22/23 | 23.8 |